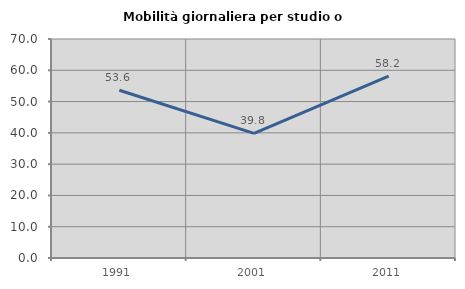
| Category | Mobilità giornaliera per studio o lavoro |
|---|---|
| 1991.0 | 53.631 |
| 2001.0 | 39.831 |
| 2011.0 | 58.163 |